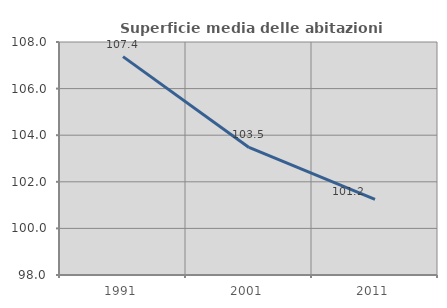
| Category | Superficie media delle abitazioni occupate |
|---|---|
| 1991.0 | 107.371 |
| 2001.0 | 103.476 |
| 2011.0 | 101.249 |